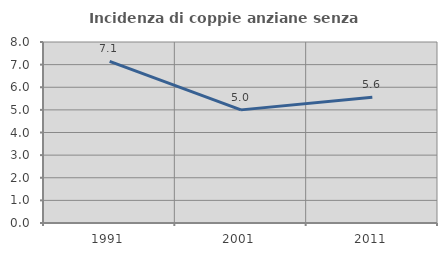
| Category | Incidenza di coppie anziane senza figli  |
|---|---|
| 1991.0 | 7.143 |
| 2001.0 | 5 |
| 2011.0 | 5.556 |